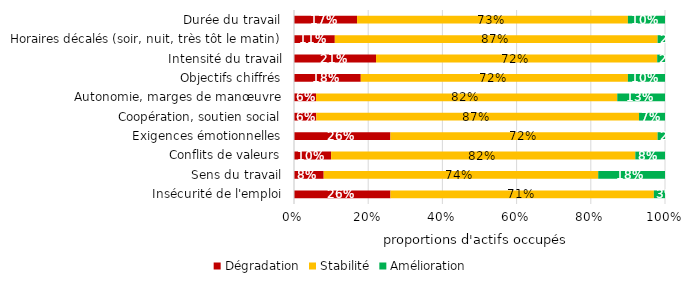
| Category | Dégradation | Stabilité | Amélioration |
|---|---|---|---|
| Insécurité de l'emploi | 0.26 | 0.71 | 0.03 |
| Sens du travail | 0.08 | 0.74 | 0.18 |
| Conflits de valeurs | 0.1 | 0.82 | 0.08 |
| Exigences émotionnelles | 0.26 | 0.72 | 0.02 |
| Coopération, soutien social | 0.06 | 0.87 | 0.07 |
| Autonomie, marges de manœuvre | 0.06 | 0.82 | 0.13 |
| Objectifs chiffrés | 0.18 | 0.72 | 0.1 |
| Intensité du travail | 0.21 | 0.72 | 0.02 |
| Horaires décalés (soir, nuit, très tôt le matin) | 0.11 | 0.87 | 0.02 |
| Durée du travail | 0.17 | 0.73 | 0.1 |